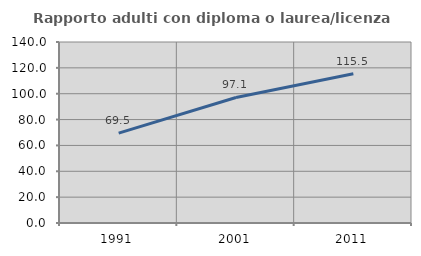
| Category | Rapporto adulti con diploma o laurea/licenza media  |
|---|---|
| 1991.0 | 69.538 |
| 2001.0 | 97.073 |
| 2011.0 | 115.502 |